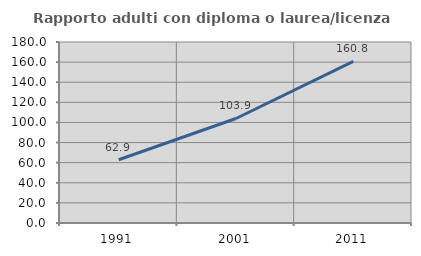
| Category | Rapporto adulti con diploma o laurea/licenza media  |
|---|---|
| 1991.0 | 62.863 |
| 2001.0 | 103.93 |
| 2011.0 | 160.773 |